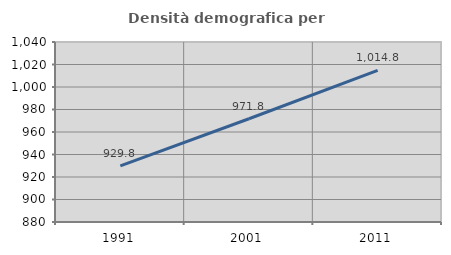
| Category | Densità demografica |
|---|---|
| 1991.0 | 929.837 |
| 2001.0 | 971.758 |
| 2011.0 | 1014.805 |